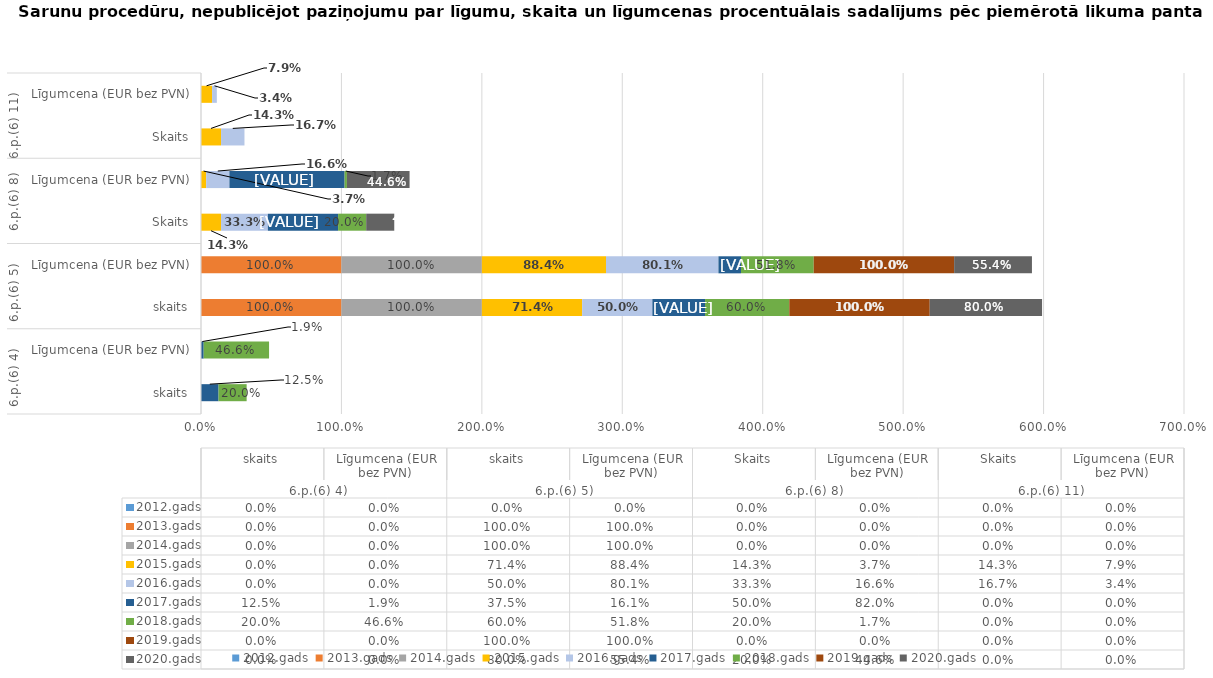
| Category | 2012.gads | 2013.gads | 2014.gads | 2015.gads | 2016.gads | 2017.gads | 2018.gads | 2019.gads | 2020.gads |
|---|---|---|---|---|---|---|---|---|---|
| 0 | 0 | 0 | 0 | 0 | 0 | 0.125 | 0.2 | 0 | 0 |
| 1 | 0 | 0 | 0 | 0 | 0 | 0.019 | 0.466 | 0 | 0 |
| 2 | 0 | 1 | 1 | 0.714 | 0.5 | 0.375 | 0.6 | 1 | 0.8 |
| 3 | 0 | 1 | 1 | 0.884 | 0.801 | 0.161 | 0.518 | 1 | 0.554 |
| 4 | 0 | 0 | 0 | 0.143 | 0.333 | 0.5 | 0.2 | 0 | 0.2 |
| 5 | 0 | 0 | 0 | 0.037 | 0.166 | 0.82 | 0.017 | 0 | 0.446 |
| 6 | 0 | 0 | 0 | 0.143 | 0.167 | 0 | 0 | 0 | 0 |
| 7 | 0 | 0 | 0 | 0.079 | 0.034 | 0 | 0 | 0 | 0 |